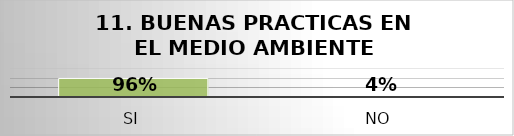
| Category | Series 2 |
|---|---|
| SI | 0.96 |
| NO | 0.04 |